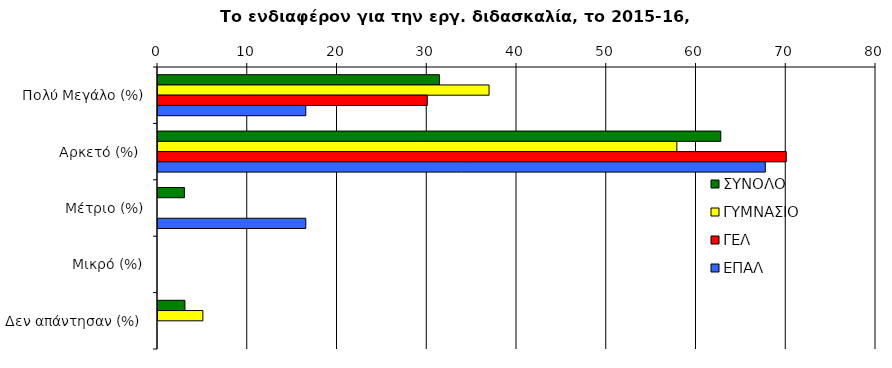
| Category | ΣΥΝΟΛΟ | ΓΥΜΝΑΣΙΟ | ΓΕΛ | ΕΠΑΛ |
|---|---|---|---|---|
| Πολύ Μεγάλο (%) | 31.353 | 36.889 | 30 | 16.467 |
| Αρκετό (%) | 62.706 | 57.811 | 70 | 67.667 |
| Μέτριο (%) | 2.941 | 0 | 0 | 16.467 |
| Μικρό (%) | 0 | 0 | 0 | 0 |
|  Δεν απάντησαν (%)  | 3 | 5 | 0 | 0 |